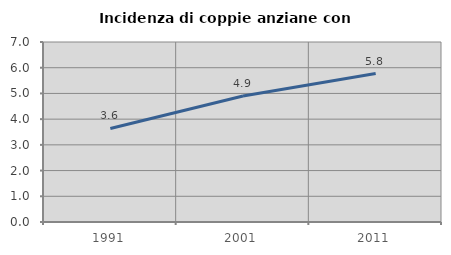
| Category | Incidenza di coppie anziane con figli |
|---|---|
| 1991.0 | 3.636 |
| 2001.0 | 4.897 |
| 2011.0 | 5.774 |